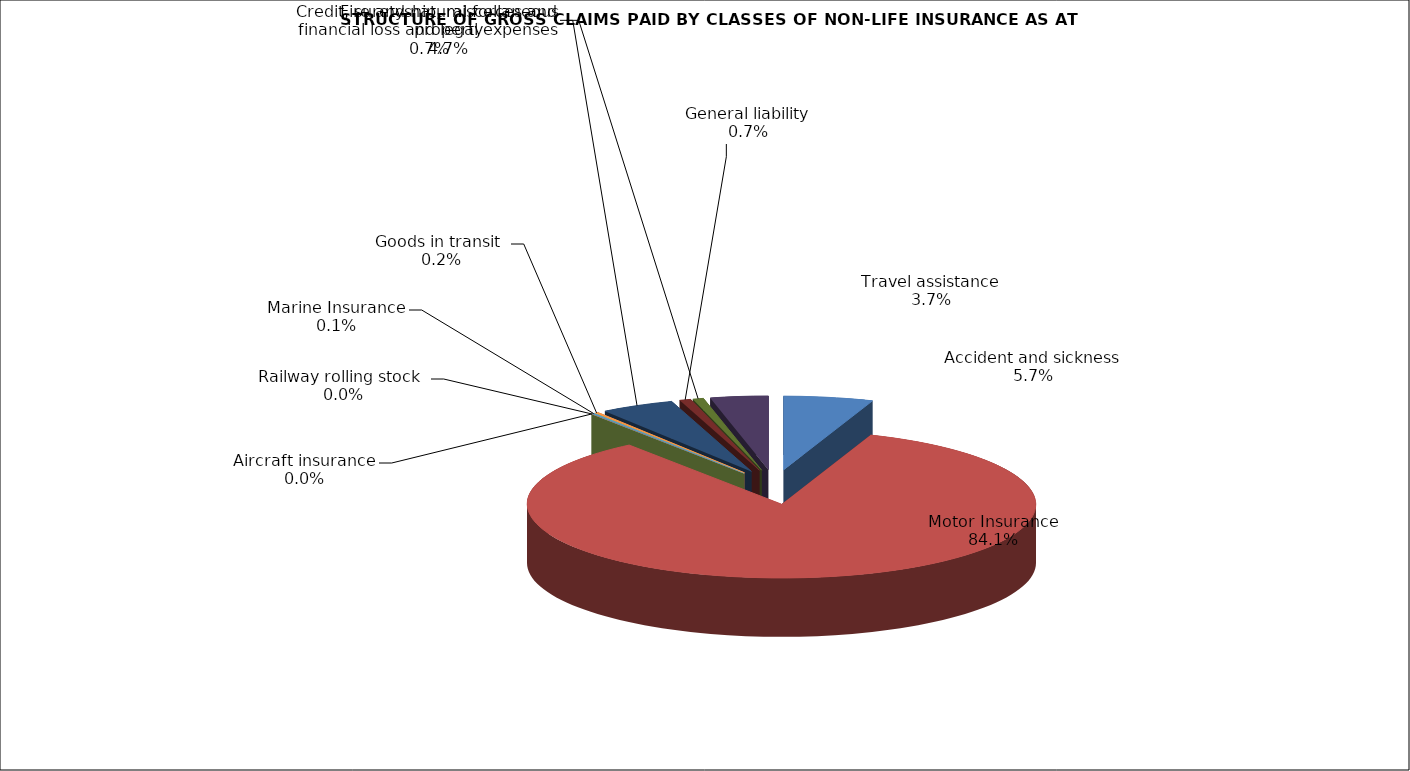
| Category | Accident and sickness |
|---|---|
| Accident and sickness | 0.057 |
| Motor Insurance | 0.841 |
| Railway rolling stock  | 0 |
| Aircraft insurance | 0 |
| Marine Insurance | 0.001 |
| Goods in transit  | 0.002 |
| Fire and natural forces and property | 0.047 |
| General liability | 0.007 |
| Credit, suretyship, miscellaneous financial loss and legal expenses | 0.007 |
| Travel assistance | 0.037 |